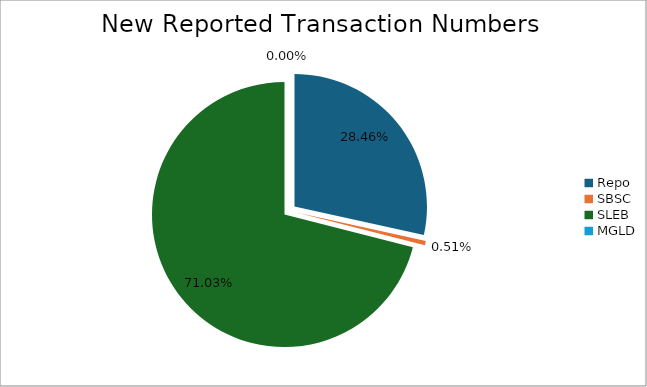
| Category | Series 0 |
|---|---|
| Repo | 349379 |
| SBSC | 6264 |
| SLEB | 871937 |
| MGLD | 27 |